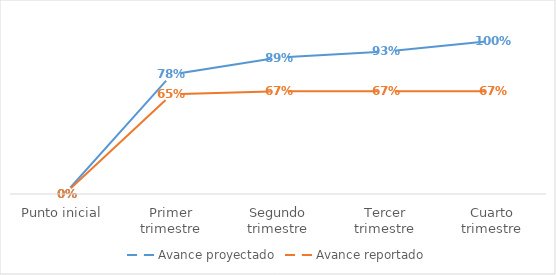
| Category | Avance proyectado | Avance reportado |
|---|---|---|
| Punto inicial | 0 | 0 |
| Primer trimestre | 0.78 | 0.65 |
| Segundo trimestre | 0.89 | 0.67 |
| Tercer trimestre | 0.93 | 0.67 |
| Cuarto trimestre | 1 | 0.67 |